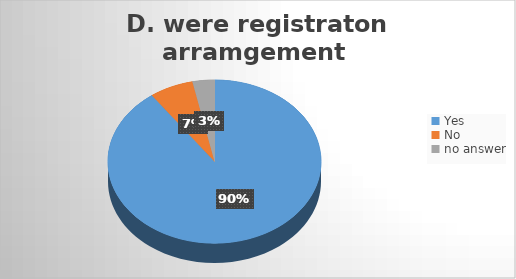
| Category | Series 0 |
|---|---|
| Yes | 27 |
| No | 2 |
| no answer | 1 |